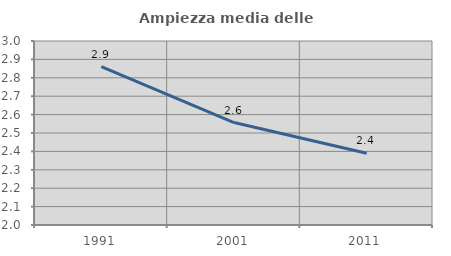
| Category | Ampiezza media delle famiglie |
|---|---|
| 1991.0 | 2.861 |
| 2001.0 | 2.557 |
| 2011.0 | 2.39 |